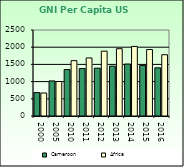
| Category | Cameroon | Africa                        |
|---|---|---|
| 2000.0 | 680 | 668.557 |
| 2005.0 | 1020 | 1002.896 |
| 2010.0 | 1350 | 1608.999 |
| 2011.0 | 1380 | 1686.521 |
| 2012.0 | 1390 | 1885.129 |
| 2013.0 | 1450 | 1956.671 |
| 2014.0 | 1510 | 2022.289 |
| 2015.0 | 1470 | 1932.283 |
| 2016.0 | 1400 | 1781.415 |